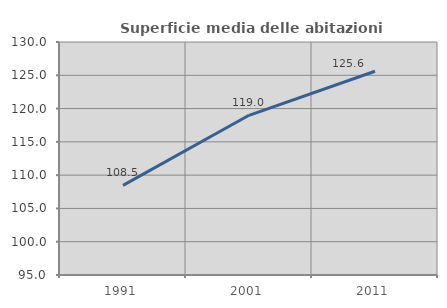
| Category | Superficie media delle abitazioni occupate |
|---|---|
| 1991.0 | 108.467 |
| 2001.0 | 118.988 |
| 2011.0 | 125.605 |